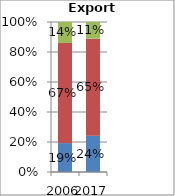
| Category | Agriculture | Fuels and mining | Manufacturing |
|---|---|---|---|
| 2006.0 | 0.193 | 0.667 | 0.14 |
| 2017.0 | 0.242 | 0.646 | 0.111 |